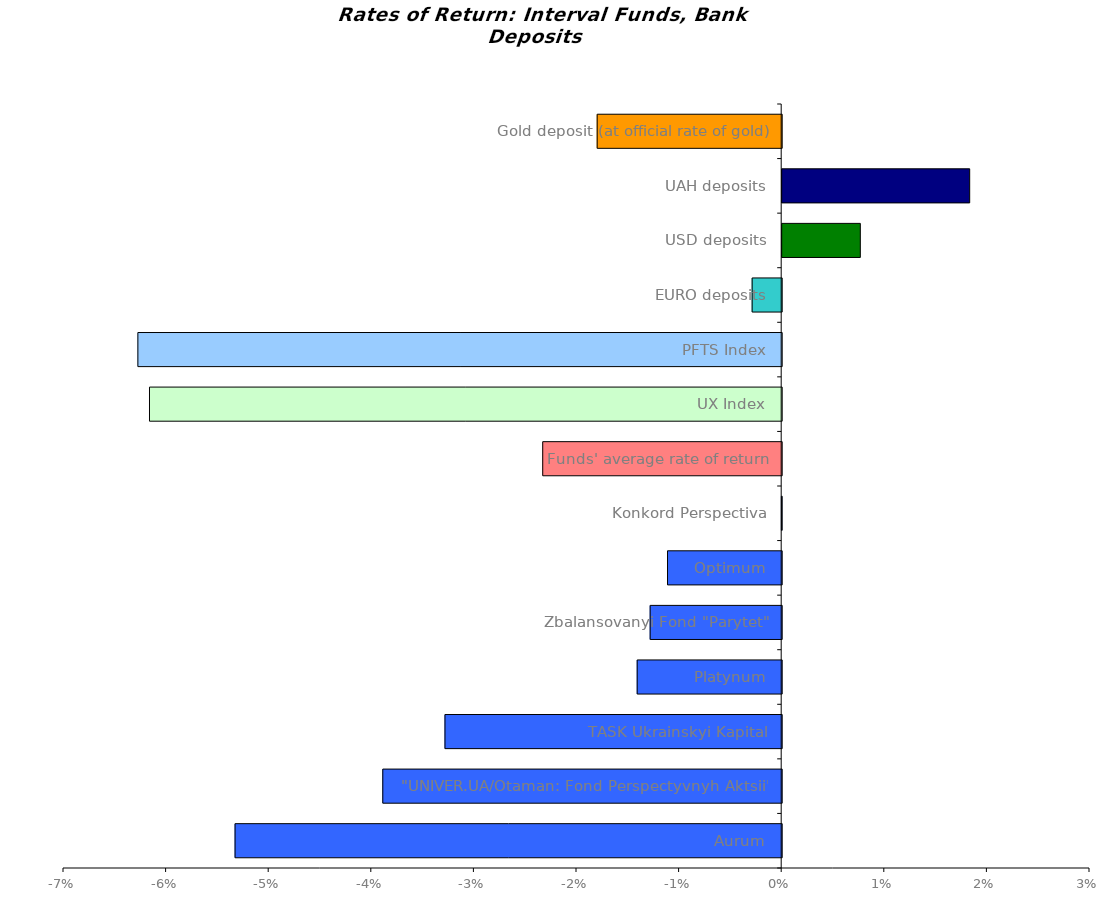
| Category | Series 0 |
|---|---|
| Aurum | -0.053 |
| "UNIVER.UA/Otaman: Fond Perspectyvnyh Aktsii" | -0.039 |
| TASK Ukrainskyi Kapital | -0.033 |
| Platynum | -0.014 |
| Zbalansovanyi Fond "Parytet" | -0.013 |
| Optimum | -0.011 |
| Konkord Perspectiva | 0 |
| Funds' average rate of return | -0.023 |
| UX Index | -0.062 |
| PFTS Index | -0.063 |
| EURO deposits | -0.003 |
| USD deposits | 0.008 |
| UAH deposits | 0.018 |
| Gold deposit (at official rate of gold) | -0.018 |